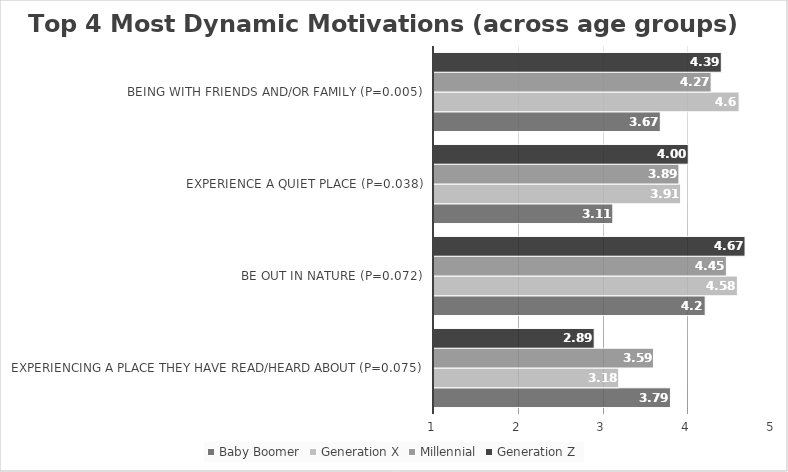
| Category | Baby Boomer | Generation X | Millennial | Generation Z |
|---|---|---|---|---|
| Experiencing a place they have read/heard about (P=0.075) | 3.79 | 3.18 | 3.59 | 2.89 |
| be out in nature (P=0.072) | 4.2 | 4.58 | 4.45 | 4.67 |
| Experience a quiet place (P=0.038) | 3.11 | 3.91 | 3.89 | 4 |
| Being with friends and‎/or family (P=0.005) | 3.67 | 4.6 | 4.27 | 4.39 |